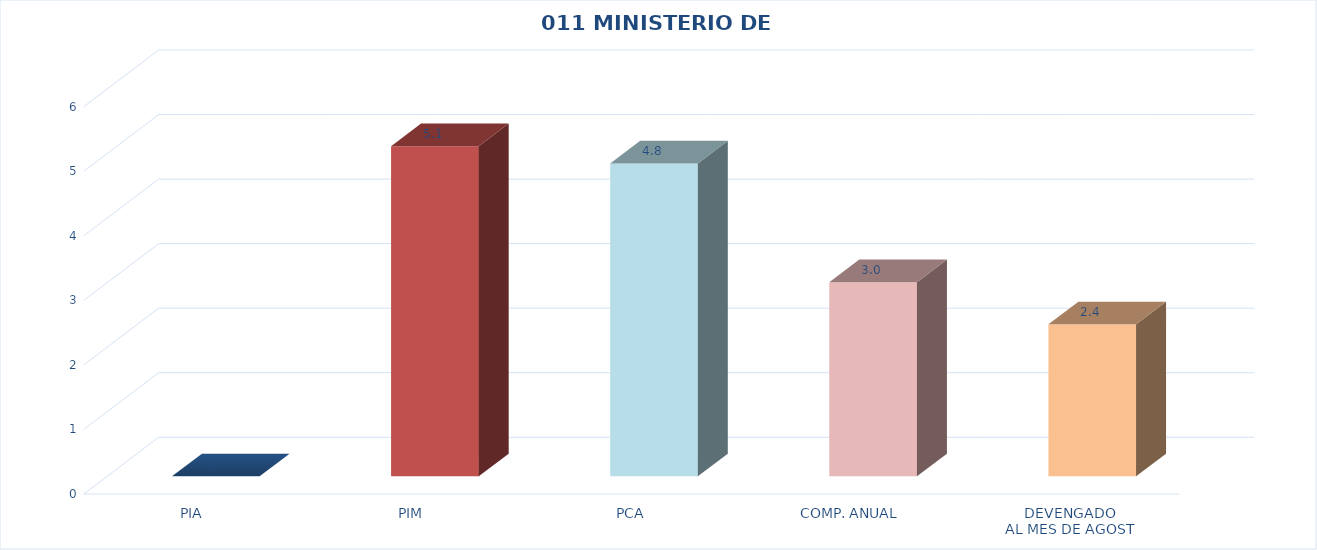
| Category | 011 MINISTERIO DE SALUD |
|---|---|
| PIA | 0 |
| PIM | 5.115 |
| PCA | 4.848 |
| COMP. ANUAL | 3.006 |
| DEVENGADO
AL MES DE AGOST | 2.355 |